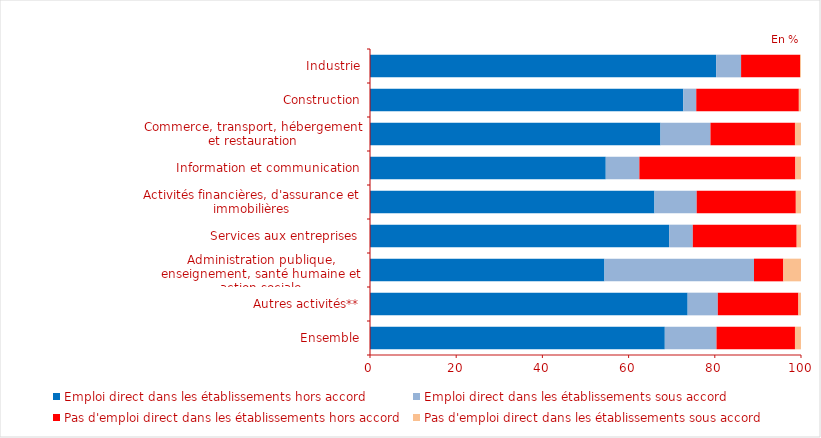
| Category | Emploi direct dans les établissements hors accord | Emploi direct dans les établissements sous accord | Pas d'emploi direct dans les établissements hors accord | Pas d'emploi direct dans les établissements sous accord |
|---|---|---|---|---|
| Ensemble | 68.4 | 12 | 18.2 | 1.4 |
| Autres activités** | 73.7 | 7 | 18.7 | 0.6 |
| Administration publique, enseignement, santé humaine et action sociale | 54.4 | 34.7 | 6.8 | 4.1 |
| Services aux entreprises | 69.4 | 5.5 | 24.1 | 1 |
| Activités financières, d'assurance et immobilières | 66 | 9.8 | 23 | 1.2 |
| Information et communication | 54.7 | 7.8 | 36.2 | 1.3 |
| Commerce, transport, hébergement et restauration | 67.4 | 11.6 | 19.6 | 1.4 |
| Construction | 72.7 | 3 | 23.8 | 0.5 |
| Industrie | 80.3 | 5.8 | 13.7 | 0.2 |